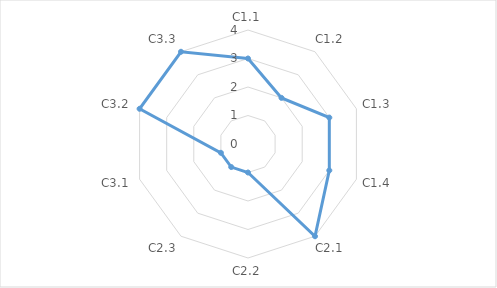
| Category | Series 0 |
|---|---|
| C1.1 | 3 |
| C1.2 | 2 |
| C1.3 | 3 |
| C1.4 | 3 |
| C2.1 | 4 |
| C2.2 | 1 |
| C2.3 | 1 |
| C3.1 | 1 |
| C3.2 | 4 |
| C3.3 | 4 |